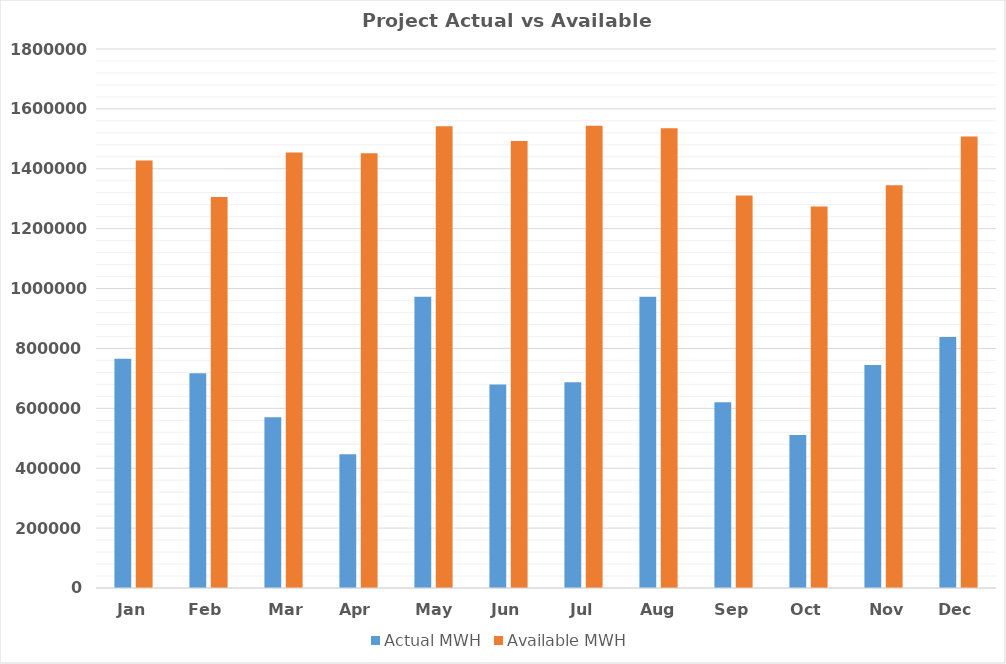
| Category | Actual MWH | Available MWH |
|---|---|---|
| Jan | 765582.5 | 1427959.3 |
| Feb | 716962.4 | 1305598.8 |
| Mar | 570462.9 | 1454393.91 |
| Apr | 446451.3 | 1452160 |
| May | 973000.1 | 1541698.22 |
| Jun | 679217.5 | 1492884.1 |
| Jul | 687414.7 | 1543800 |
| Aug | 972740.1 | 1535713.84 |
| Sep | 620026 | 1311019.45 |
| Oct | 510970.7 | 1273867.61 |
| Nov | 744712.2 | 1344750.83 |
| Dec | 838616.4 | 1507427.79 |